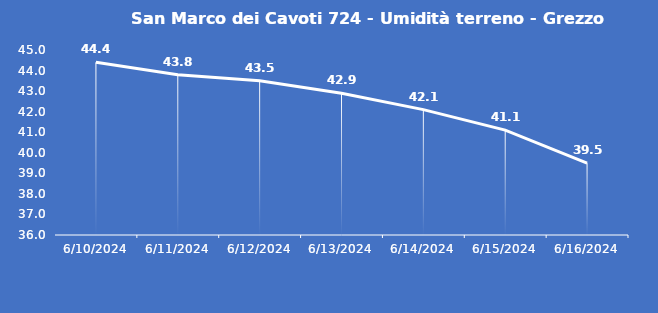
| Category | San Marco dei Cavoti 724 - Umidità terreno - Grezzo (%VWC) |
|---|---|
| 6/10/24 | 44.4 |
| 6/11/24 | 43.8 |
| 6/12/24 | 43.5 |
| 6/13/24 | 42.9 |
| 6/14/24 | 42.1 |
| 6/15/24 | 41.1 |
| 6/16/24 | 39.5 |